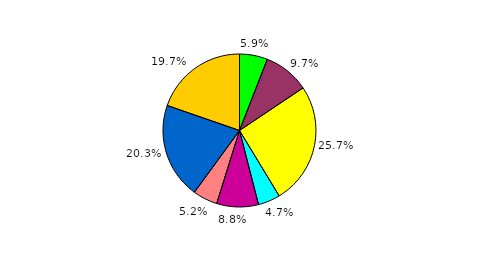
| Category | Series 0 |
|---|---|
| 0 | 5.922 |
| 1 | 9.689 |
| 2 | 25.711 |
| 3 | 4.678 |
| 4 | 8.822 |
| 5 | 5.211 |
| 6 | 20.267 |
| 7 | 19.7 |